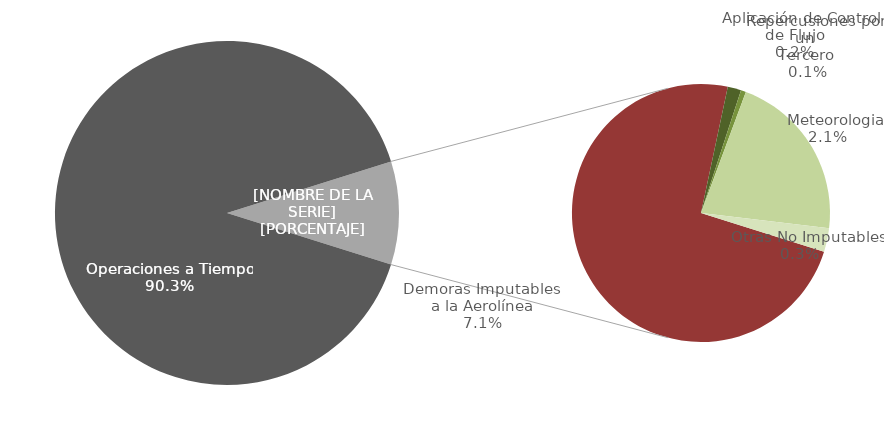
| Category | Demoras |
|---|---|
| Operaciones a Tiempo | 17663 |
| Demoras Imputables 
a la Aerolínea | 1394 |
|    Aplicación de Control 
de Flujo | 32 |
|    Repercusiones por un 
Tercero | 12 |
|    Meteorologia | 403 |
|    Otras No Imputables | 56 |